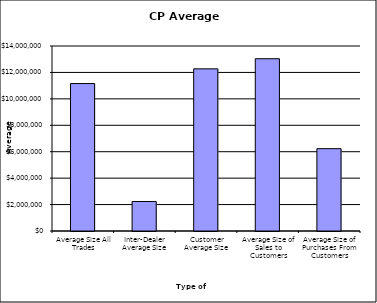
| Category | Security Type |
|---|---|
| Average Size All Trades | 11156280.74 |
| Inter-Dealer Average Size | 2232754.902 |
| Customer Average Size | 12270356.181 |
| Average Size of Sales to Customers | 13036740.69 |
| Average Size of Purchases From Customers | 6230913.043 |